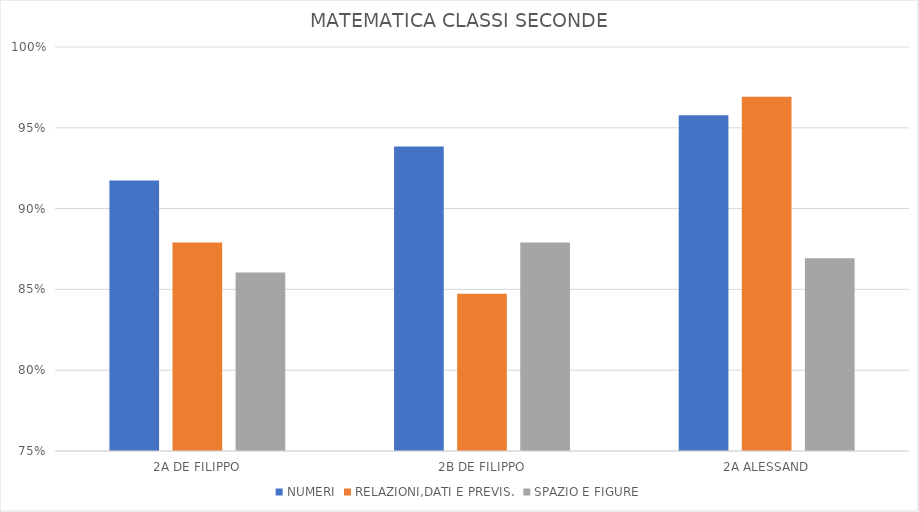
| Category | NUMERI | RELAZIONI,DATI E PREVIS. | SPAZIO E FIGURE |
|---|---|---|---|
| 2A DE FILIPPO | 0.917 | 0.879 | 0.861 |
| 2B DE FILIPPO | 0.938 | 0.847 | 0.879 |
| 2A ALESSAND | 0.958 | 0.969 | 0.869 |